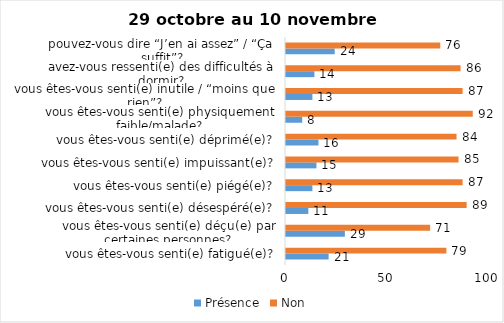
| Category | Présence | Non |
|---|---|---|
| vous êtes-vous senti(e) fatigué(e)? | 21 | 79 |
| vous êtes-vous senti(e) déçu(e) par certaines personnes? | 29 | 71 |
| vous êtes-vous senti(e) désespéré(e)? | 11 | 89 |
| vous êtes-vous senti(e) piégé(e)? | 13 | 87 |
| vous êtes-vous senti(e) impuissant(e)? | 15 | 85 |
| vous êtes-vous senti(e) déprimé(e)? | 16 | 84 |
| vous êtes-vous senti(e) physiquement faible/malade? | 8 | 92 |
| vous êtes-vous senti(e) inutile / “moins que rien”? | 13 | 87 |
| avez-vous ressenti(e) des difficultés à dormir? | 14 | 86 |
| pouvez-vous dire “J’en ai assez” / “Ça suffit”? | 24 | 76 |